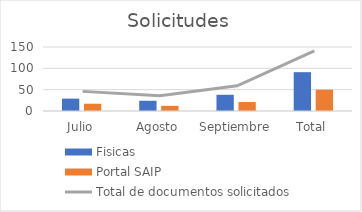
| Category | Fisicas | Portal SAIP |
|---|---|---|
| Julio | 29 | 17 |
| Agosto | 24 | 12 |
| Septiembre | 38 | 21 |
| Total | 91 | 50 |